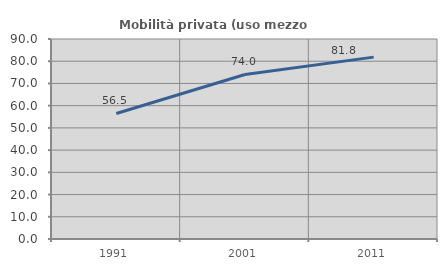
| Category | Mobilità privata (uso mezzo privato) |
|---|---|
| 1991.0 | 56.477 |
| 2001.0 | 74.043 |
| 2011.0 | 81.838 |